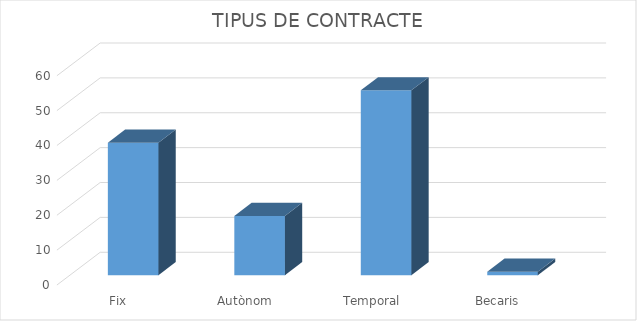
| Category | Series 0 |
|---|---|
| Fix | 38 |
| Autònom | 17 |
| Temporal | 53 |
| Becaris | 1 |